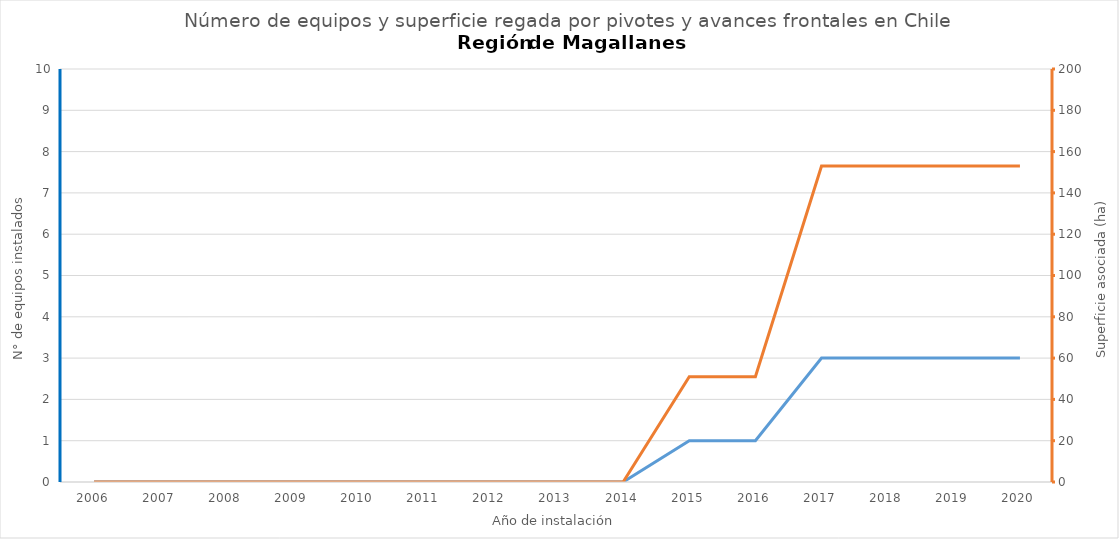
| Category | N° |
|---|---|
| 2006.0 | 0 |
| 2007.0 | 0 |
| 2008.0 | 0 |
| 2009.0 | 0 |
| 2010.0 | 0 |
| 2011.0 | 0 |
| 2012.0 | 0 |
| 2013.0 | 0 |
| 2014.0 | 0 |
| 2015.0 | 1 |
| 2016.0 | 1 |
| 2017.0 | 3 |
| 2018.0 | 3 |
| 2019.0 | 3 |
| 2020.0 | 3 |